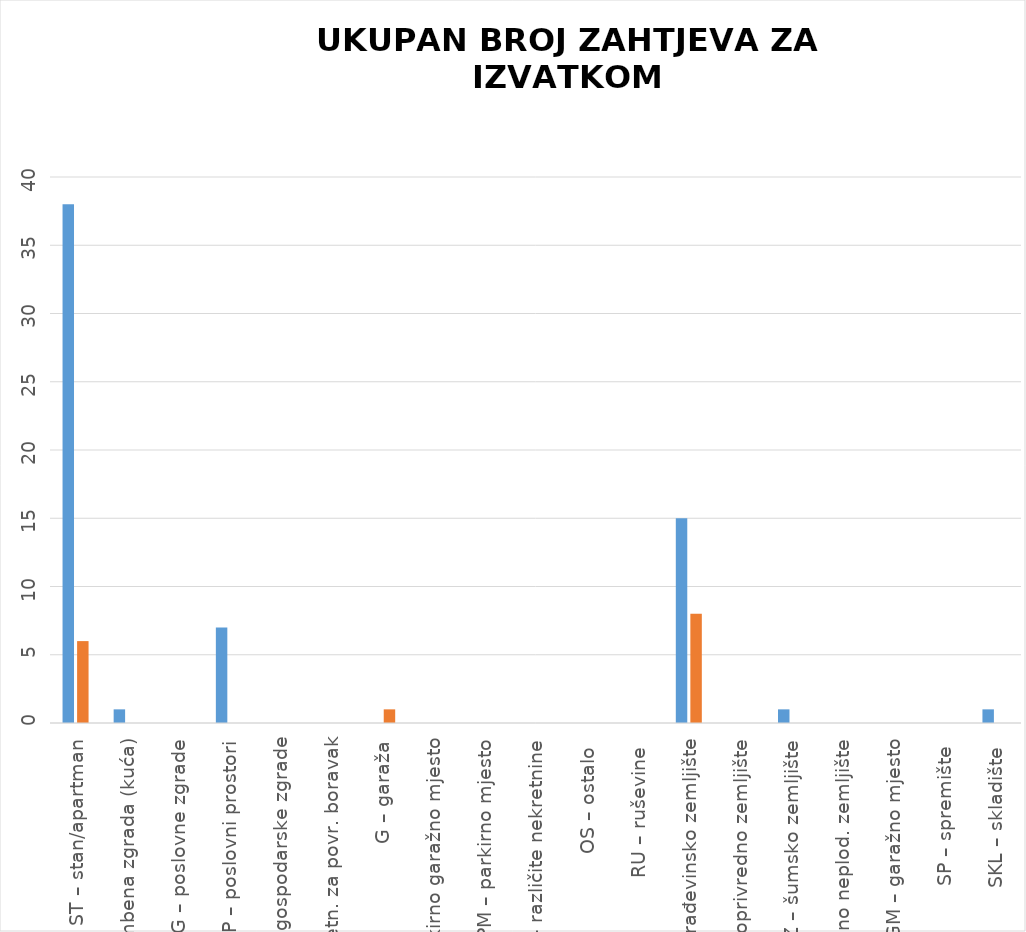
| Category | BROJ ZAPRIMLJENIH ZAHTJEVA KROZ APLIKACIJU eNekretnine | BROJ ZAPRIMLJENIH ZAHTJEVA IZVAN APLIKACIJE
(Popunjava službenik) |
|---|---|---|
| ST – stan/apartman | 38 | 6 |
| OK – stambena zgrada (kuća) | 1 | 0 |
| PZG – poslovne zgrade | 0 | 0 |
| PP – poslovni prostori | 7 | 0 |
| GZG – gospodarske zgrade | 0 | 0 |
| VIK – nekretn. za povr. boravak | 0 | 0 |
| G – garaža | 0 | 1 |
| PGM – parkirno garažno mjesto | 0 | 0 |
| VPM – parkirno mjesto | 0 | 0 |
| RN – različite nekretnine | 0 | 0 |
| OS – ostalo  | 0 | 0 |
| RU – ruševine  | 0 | 0 |
| GZ – građevinsko zemljište | 15 | 8 |
| PZ – poljoprivredno zemljište | 0 | 0 |
| ŠZ – šumsko zemljište | 1 | 0 |
| PNZ – prirodno neplod. zemljište | 0 | 0 |
| GM – garažno mjesto | 0 | 0 |
| SP – spremište  | 0 | 0 |
| SKL – skladište  | 1 | 0 |